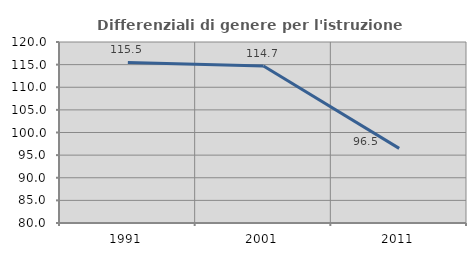
| Category | Differenziali di genere per l'istruzione superiore |
|---|---|
| 1991.0 | 115.478 |
| 2001.0 | 114.713 |
| 2011.0 | 96.493 |